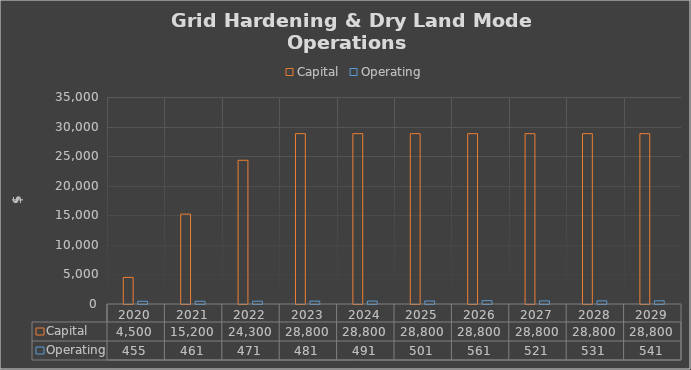
| Category | Capital | Operating |
|---|---|---|
| 2020.0 | 4500 | 455 |
| 2021.0 | 15200 | 461 |
| 2022.0 | 24300 | 471 |
| 2023.0 | 28800 | 481 |
| 2024.0 | 28800 | 491 |
| 2025.0 | 28800 | 501 |
| 2026.0 | 28800 | 561 |
| 2027.0 | 28800 | 521 |
| 2028.0 | 28800 | 531 |
| 2029.0 | 28800 | 541 |